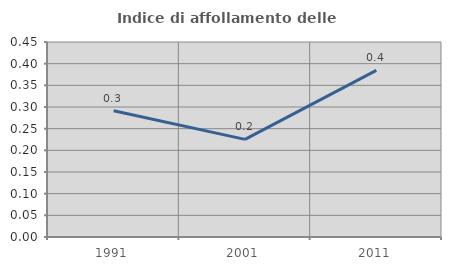
| Category | Indice di affollamento delle abitazioni  |
|---|---|
| 1991.0 | 0.292 |
| 2001.0 | 0.225 |
| 2011.0 | 0.385 |